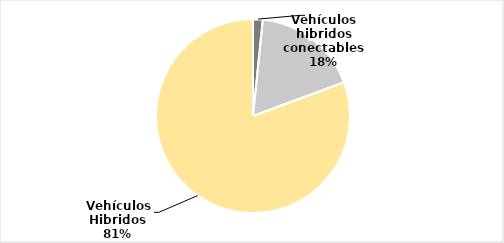
| Category | Series 0 |
|---|---|
| Vehículos eléctricos | 3 |
| Vehículos hibridos conectables | 33 |
|  Vehículos Hibridos | 150 |